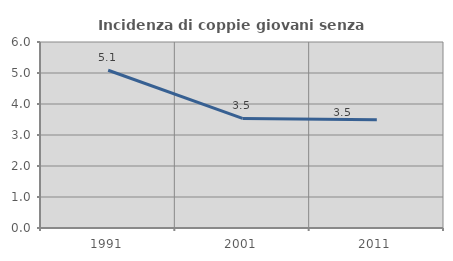
| Category | Incidenza di coppie giovani senza figli |
|---|---|
| 1991.0 | 5.09 |
| 2001.0 | 3.536 |
| 2011.0 | 3.493 |